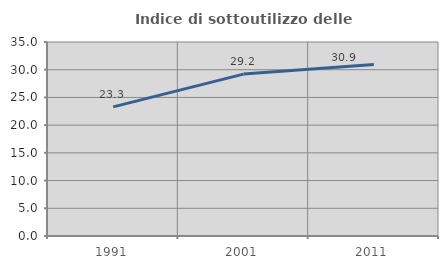
| Category | Indice di sottoutilizzo delle abitazioni  |
|---|---|
| 1991.0 | 23.304 |
| 2001.0 | 29.21 |
| 2011.0 | 30.94 |